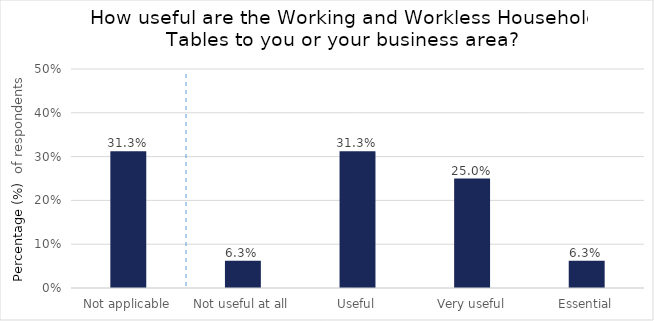
| Category | Not applicable |
|---|---|
| Not applicable | 0.312 |
| Not useful at all | 0.062 |
| Useful | 0.312 |
| Very useful | 0.25 |
| Essential | 0.062 |